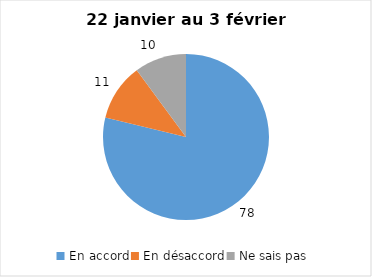
| Category | Series 0 |
|---|---|
| En accord | 78 |
| En désaccord | 11 |
| Ne sais pas | 10 |